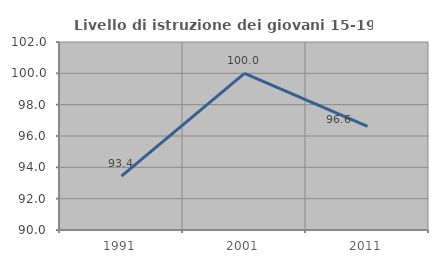
| Category | Livello di istruzione dei giovani 15-19 anni |
|---|---|
| 1991.0 | 93.443 |
| 2001.0 | 100 |
| 2011.0 | 96.61 |